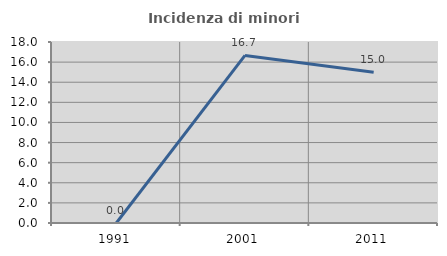
| Category | Incidenza di minori stranieri |
|---|---|
| 1991.0 | 0 |
| 2001.0 | 16.667 |
| 2011.0 | 15 |